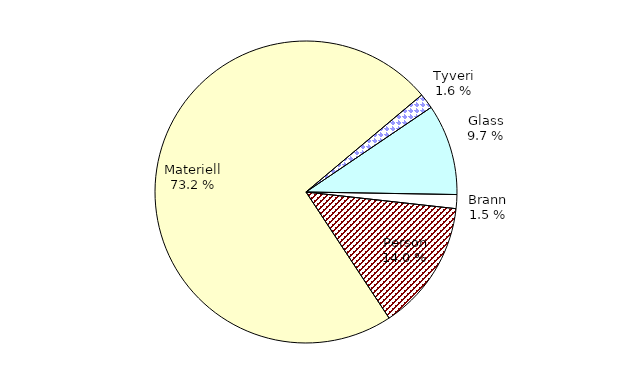
| Category | Series 0 |
|---|---|
| Tyveri | 59.272 |
| Glass | 349.752 |
| Brann | 53.692 |
| Person | 501.815 |
| Materiell | 2629.547 |